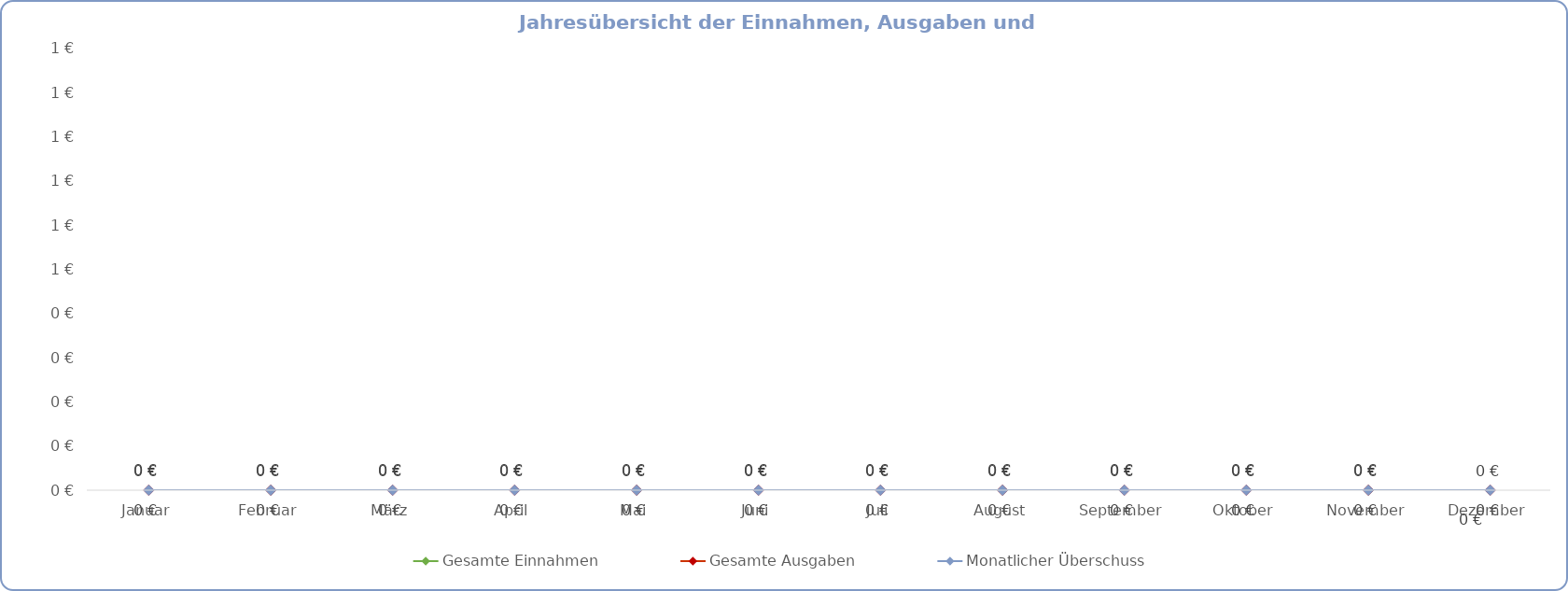
| Category |  Gesamte Einnahmen  |  Gesamte Ausgaben  | Monatlicher Überschuss |
|---|---|---|---|
| Januar | 0 | 0 | 0 |
| Februar | 0 | 0 | 0 |
| März | 0 | 0 | 0 |
| April | 0 | 0 | 0 |
| Mai | 0 | 0 | 0 |
| Juni | 0 | 0 | 0 |
| Juli | 0 | 0 | 0 |
| August | 0 | 0 | 0 |
| September | 0 | 0 | 0 |
| Oktober | 0 | 0 | 0 |
| November | 0 | 0 | 0 |
| Dezember | 0 | 0 | 0 |